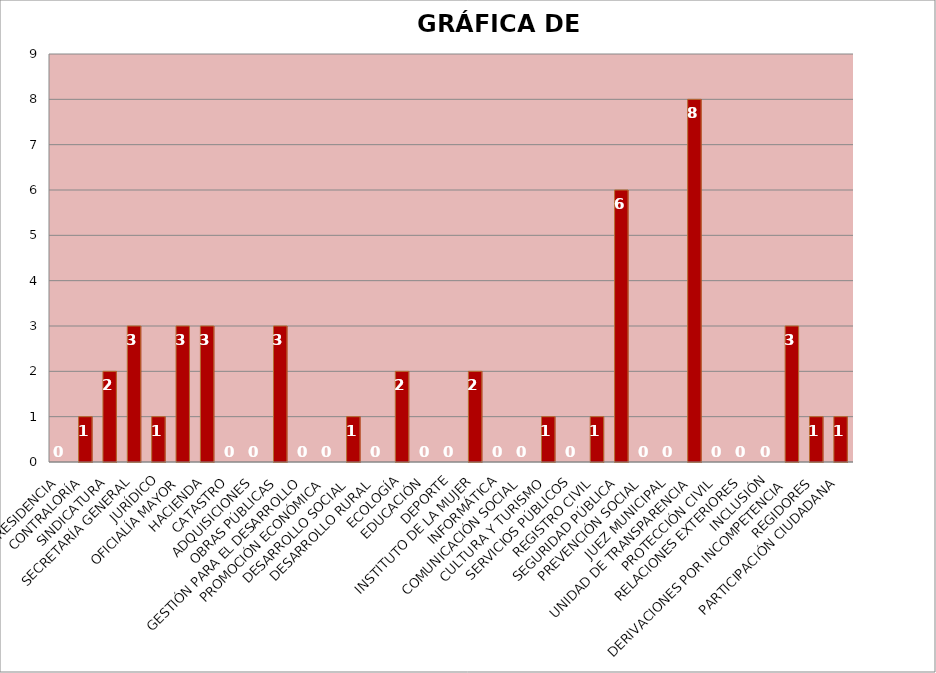
| Category | Series 0 |
|---|---|
| PRESIDENCIA | 0 |
| CONTRALORÍA | 1 |
| SINDICATURA | 2 |
| SECRETARÍA GENERAL | 3 |
| JURÍDICO | 1 |
| OFICIALÍA MAYOR | 3 |
| HACIENDA | 3 |
| CATASTRO | 0 |
| ADQUISICIONES | 0 |
| OBRAS PÚBLICAS | 3 |
| GESTIÓN PARA EL DESARROLLO | 0 |
| PROMOCIÓN ECONÓMICA | 0 |
| DESARROLLO SOCIAL | 1 |
| DESARROLLO RURAL | 0 |
| ECOLOGÍA | 2 |
| EDUCACIÓN | 0 |
| DEPORTE | 0 |
| INSTITUTO DE LA MUJER | 2 |
| INFORMÁTICA | 0 |
| COMUNICACIÓN SOCIAL | 0 |
| CULTURA Y TURISMO | 1 |
| SERVICIOS PÚBLICOS | 0 |
| REGISTRO CIVIL | 1 |
| SEGURIDAD PÚBLICA | 6 |
| PREVENCIÓN SOCIAL | 0 |
| JUEZ MUNICIPAL | 0 |
| UNIDAD DE TRANSPARENCIA | 8 |
| PROTECCIÓN CIVIL | 0 |
| RELACIONES EXTERIORES | 0 |
| INCLUSIÓN | 0 |
| DERIVACIONES POR INCOMPETENCIA | 3 |
| REGIDORES | 1 |
| PARTICIPACIÓN CIUDADANA | 1 |